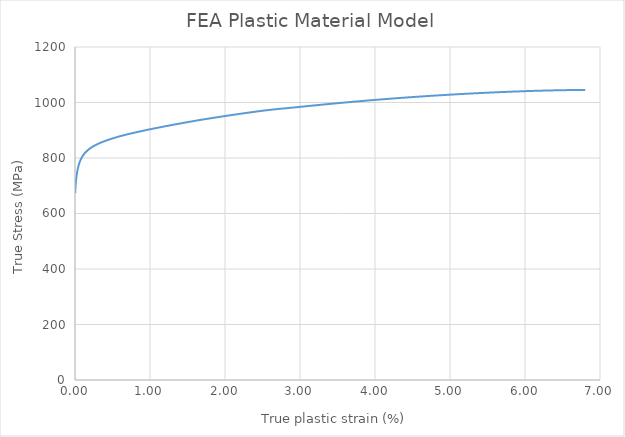
| Category | Series 0 |
|---|---|
| 0.0017616880151286993 | 673.632 |
| 0.008403152648236201 | 702.047 |
| 0.016862855998703147 | 726.623 |
| 0.027291864105012192 | 747.034 |
| 0.039383235160713376 | 763.929 |
| 0.05292911051866906 | 777.743 |
| 0.06766548516431452 | 789.034 |
| 0.08334510321599106 | 798.324 |
| 0.09974437598286301 | 806.085 |
| 0.11666862788183979 | 812.729 |
| 0.1340172182026393 | 818.468 |
| 0.15170188121643072 | 823.489 |
| 0.16964148285664019 | 827.963 |
| 0.1878094826076597 | 831.947 |
| 0.206159085278784 | 835.539 |
| 0.22462478523562804 | 838.878 |
| 0.24319912700896226 | 841.98 |
| 0.2619194940210921 | 844.764 |
| 0.28072487660874357 | 847.361 |
| 0.29956160390301534 | 849.885 |
| 0.3184661813447992 | 852.258 |
| 0.33742974530748804 | 854.498 |
| 0.3564352822394598 | 856.641 |
| 0.37548871659019445 | 858.675 |
| 0.3945427041601182 | 860.701 |
| 0.41365110117698817 | 862.604 |
| 0.43279292542765324 | 864.429 |
| 0.45194954480690536 | 866.214 |
| 0.47113630441185833 | 867.928 |
| 0.49034007254139733 | 869.598 |
| 0.5095607981608199 | 871.225 |
| 0.5288176978213538 | 872.767 |
| 0.5480609265612574 | 874.33 |
| 0.5673085640047968 | 875.877 |
| 0.5865693366143762 | 877.389 |
| 0.6058119453366085 | 878.932 |
| 0.6251492661223561 | 880.264 |
| 0.6445033137288448 | 881.553 |
| 0.663787181921031 | 882.985 |
| 0.6831141888397586 | 884.316 |
| 0.7024772632728765 | 885.563 |
| 0.7218518878790943 | 886.777 |
| 0.74121176712949 | 888.016 |
| 0.7605796193391979 | 889.229 |
| 0.7799441440712891 | 890.442 |
| 0.7993026796232002 | 891.66 |
| 0.8186622167340719 | 892.869 |
| 0.8380372115632981 | 894.036 |
| 0.8574227630842741 | 895.173 |
| 0.8767981002015321 | 896.324 |
| 0.8961674497990773 | 897.481 |
| 0.9155429349305845 | 898.616 |
| 0.9349280082200732 | 899.724 |
| 0.9543017568538025 | 900.847 |
| 0.9736828581999124 | 901.948 |
| 0.9930615175098723 | 903.045 |
| 1.012444513083614 | 904.126 |
| 1.0318126429148455 | 905.231 |
| 1.0512273703280584 | 906.227 |
| 1.070604179148255 | 907.298 |
| 1.0900016322542103 | 908.316 |
| 1.1093773767662758 | 909.373 |
| 1.1287343888276786 | 910.464 |
| 1.1481416184761977 | 911.437 |
| 1.167536587363769 | 912.429 |
| 1.1869026390105442 | 913.477 |
| 1.2062798961085264 | 914.492 |
| 1.2256662324555976 | 915.479 |
| 1.2450421819659354 | 916.482 |
| 1.2644197278524834 | 917.472 |
| 1.283801971352826 | 918.445 |
| 1.3031892726645378 | 919.399 |
| 1.3225604048979605 | 920.381 |
| 1.3419180950797238 | 921.384 |
| 1.3613000569400646 | 922.326 |
| 1.3806752362087862 | 923.275 |
| 1.4000469473275434 | 924.223 |
| 1.4193986343832268 | 925.208 |
| 1.4387605422762306 | 926.162 |
| 1.4581078397188545 | 927.14 |
| 1.4774812638846004 | 928.054 |
| 1.49681401229036 | 929.048 |
| 1.5161256947597983 | 930.08 |
| 1.5355235273010361 | 930.917 |
| 1.5549453438363876 | 931.693 |
| 1.5743040261576575 | 932.599 |
| 1.5936327689486571 | 933.562 |
| 1.6129489022015098 | 934.546 |
| 1.6322686685440588 | 935.513 |
| 1.6516176821922417 | 936.409 |
| 1.6709610053161135 | 937.309 |
| 1.6903308788716112 | 938.143 |
| 1.7097056184357307 | 938.959 |
| 1.7290938190480343 | 939.737 |
| 1.7484359853842641 | 940.608 |
| 1.767792732305169 | 941.439 |
| 1.7871778796046538 | 942.199 |
| 1.8065253129814378 | 943.035 |
| 1.8258345520654238 | 943.946 |
| 1.8452245632540407 | 944.672 |
| 1.8645844579670008 | 945.456 |
| 1.8839016154680852 | 946.326 |
| 1.9032282399676363 | 947.168 |
| 1.9225747246297324 | 947.957 |
| 1.9419168242799247 | 948.749 |
| 1.9612374125100953 | 949.579 |
| 1.9805317899627917 | 950.46 |
| 1.9999063269558408 | 951.156 |
| 2.019254516676692 | 951.901 |
| 2.0385688250035154 | 952.714 |
| 2.0578741861739296 | 953.538 |
| 2.077204402778474 | 954.3 |
| 2.096526022527651 | 955.072 |
| 2.1158386621815803 | 955.856 |
| 2.13515968259653 | 956.614 |
| 2.1544849169993885 | 957.354 |
| 2.1737998507044813 | 958.11 |
| 2.193112878408387 | 958.861 |
| 2.2124146243828013 | 959.629 |
| 2.2317208448768935 | 960.379 |
| 2.2510149531231574 | 961.148 |
| 2.2703347457259113 | 961.853 |
| 2.289636937181222 | 962.588 |
| 2.308945665295502 | 963.3 |
| 2.3282474580624646 | 964.02 |
| 2.347539229302683 | 964.754 |
| 2.3668325468165436 | 965.477 |
| 2.386119368967506 | 966.206 |
| 2.4054186853332613 | 966.899 |
| 2.4247228772984597 | 967.573 |
| 2.443998031990761 | 968.303 |
| 2.4632982806266632 | 968.97 |
| 2.482586130401623 | 969.656 |
| 2.5018591280532867 | 970.368 |
| 2.5211480274244353 | 971.035 |
| 2.540465845020651 | 971.63 |
| 2.5597817799139877 | 972.222 |
| 2.5790958554715107 | 972.809 |
| 2.5984080729983656 | 973.392 |
| 2.617718212120904 | 973.972 |
| 2.637026176486001 | 974.548 |
| 2.656332447009647 | 975.12 |
| 2.675636720165038 | 975.688 |
| 2.6949387821549244 | 976.253 |
| 2.7142416194265375 | 976.808 |
| 2.7335761034678754 | 977.284 |
| 2.752914472991351 | 977.743 |
| 2.7722483671025184 | 978.204 |
| 2.7915675151008923 | 978.689 |
| 2.810870008255817 | 979.204 |
| 2.8301677381297314 | 979.721 |
| 2.8494636719185746 | 980.234 |
| 2.8687578290557374 | 980.742 |
| 2.888047396769901 | 981.253 |
| 2.907331511597753 | 981.768 |
| 2.9266114305200714 | 982.284 |
| 2.9458847028520037 | 982.806 |
| 2.9651500813154232 | 983.339 |
| 2.984415319149578 | 983.863 |
| 3.0036799052789576 | 984.38 |
| 3.022939477816899 | 984.901 |
| 3.042196544867967 | 985.419 |
| 3.061447759645913 | 985.942 |
| 3.0806901320051603 | 986.477 |
| 3.0999264409499956 | 987.017 |
| 3.119165511087871 | 987.542 |
| 3.1384097999147604 | 988.048 |
| 3.157652295851479 | 988.55 |
| 3.176895106528838 | 989.042 |
| 3.196126554548673 | 989.552 |
| 3.2153459851027364 | 990.081 |
| 3.234562850436181 | 990.607 |
| 3.253779370048007 | 991.126 |
| 3.2729991531020617 | 991.63 |
| 3.2922168091145654 | 992.13 |
| 3.3114368449095357 | 992.616 |
| 3.3306454262181546 | 993.12 |
| 3.34984310144253 | 993.641 |
| 3.36903927765612 | 994.156 |
| 3.388236997209315 | 994.66 |
| 3.4074371215824977 | 995.151 |
| 3.4266343291668666 | 995.639 |
| 3.4458296850303203 | 996.124 |
| 3.465017992373908 | 996.616 |
| 3.484198711129193 | 997.118 |
| 3.503376905432491 | 997.617 |
| 3.5225577232977043 | 998.101 |
| 3.541746707064882 | 998.559 |
| 3.560932129553001 | 999.017 |
| 3.580114613547526 | 999.473 |
| 3.599284699836046 | 999.949 |
| 3.6184456456079332 | 1000.437 |
| 3.6376076541155067 | 1000.915 |
| 3.656770425071038 | 1001.383 |
| 3.6759365744768457 | 1001.835 |
| 3.69509633002034 | 1002.293 |
| 3.714254225215857 | 1002.747 |
| 3.7334083690530546 | 1003.202 |
| 3.752555739593984 | 1003.664 |
| 3.7716995390442034 | 1004.125 |
| 3.790846486812733 | 1004.571 |
| 3.8099939669505374 | 1005.008 |
| 3.8291358795737995 | 1005.449 |
| 3.8482753872053697 | 1005.887 |
| 3.867408648094264 | 1006.331 |
| 3.886533994145939 | 1006.786 |
| 3.905658352168031 | 1007.234 |
| 3.9247859301477908 | 1007.666 |
| 3.943920034249236 | 1008.075 |
| 3.9630518928461873 | 1008.481 |
| 3.9821792349070586 | 1008.889 |
| 4.001295759705722 | 1009.314 |
| 4.020402285609338 | 1009.753 |
| 4.039509351072906 | 1010.183 |
| 4.0586147865773805 | 1010.608 |
| 4.077724095951615 | 1011.016 |
| 4.096833347928689 | 1011.416 |
| 4.115941788950897 | 1011.809 |
| 4.135038347438487 | 1012.221 |
| 4.154126576042353 | 1012.644 |
| 4.173214867779718 | 1013.059 |
| 4.192304844011336 | 1013.462 |
| 4.21139546910565 | 1013.854 |
| 4.230483104636811 | 1014.246 |
| 4.249569586321075 | 1014.631 |
| 4.268648048205999 | 1015.027 |
| 4.287722524300546 | 1015.424 |
| 4.306793747930248 | 1015.82 |
| 4.325864041576908 | 1016.209 |
| 4.344941370661999 | 1016.575 |
| 4.364017536894622 | 1016.934 |
| 4.383093493136643 | 1017.286 |
| 4.402158140989183 | 1017.655 |
| 4.421209773698958 | 1018.046 |
| 4.440261566766263 | 1018.429 |
| 4.459312883561803 | 1018.804 |
| 4.478369393873186 | 1019.159 |
| 4.497422698333329 | 1019.513 |
| 4.516476486302468 | 1019.857 |
| 4.535523420779981 | 1020.209 |
| 4.554564213450863 | 1020.567 |
| 4.573599681520053 | 1020.929 |
| 4.592633234846081 | 1021.287 |
| 4.611671152983074 | 1021.626 |
| 4.630705639045711 | 1021.965 |
| 4.649740230404776 | 1022.296 |
| 4.668769716435783 | 1022.63 |
| 4.687790604997014 | 1022.976 |
| 4.706800231682059 | 1023.339 |
| 4.725815285483115 | 1023.682 |
| 4.744835282642407 | 1024.004 |
| 4.7638569788731795 | 1024.314 |
| 4.782878986725088 | 1024.616 |
| 4.801892676290375 | 1024.928 |
| 4.820897710492915 | 1025.252 |
| 4.83989192624763 | 1025.593 |
| 4.8588858564289215 | 1025.926 |
| 4.877881105600689 | 1026.247 |
| 4.896879801241061 | 1026.553 |
| 4.915883071288172 | 1026.839 |
| 4.934878850263214 | 1027.134 |
| 4.953864153351674 | 1027.445 |
| 4.972837561469971 | 1027.776 |
| 4.9918116337722145 | 1028.097 |
| 5.01078697016645 | 1028.407 |
| 5.029766215678242 | 1028.699 |
| 5.0487473375611644 | 1028.978 |
| 5.067725618460582 | 1029.255 |
| 5.086690705256967 | 1029.555 |
| 5.105650411510569 | 1029.859 |
| 5.124606434338731 | 1030.164 |
| 5.143561809633303 | 1030.461 |
| 5.162526901858329 | 1030.728 |
| 5.181493499545476 | 1030.982 |
| 5.200458617969592 | 1031.232 |
| 5.219410381353423 | 1031.504 |
| 5.238354286386505 | 1031.786 |
| 5.257290741738822 | 1032.078 |
| 5.2762261975185725 | 1032.364 |
| 5.295166630386058 | 1032.629 |
| 5.3141117268445575 | 1032.875 |
| 5.333053771780245 | 1033.12 |
| 5.351989828807113 | 1033.37 |
| 5.370920014715032 | 1033.626 |
| 5.389841239232599 | 1033.894 |
| 5.408760147882037 | 1034.16 |
| 5.427679444813724 | 1034.416 |
| 5.446603202867008 | 1034.654 |
| 5.465525373207353 | 1034.886 |
| 5.484443137789347 | 1035.121 |
| 5.503356539277264 | 1035.357 |
| 5.522259703260668 | 1035.609 |
| 5.541155292516832 | 1035.871 |
| 5.56005380256028 | 1036.117 |
| 5.578959736267238 | 1036.338 |
| 5.597870155139634 | 1036.539 |
| 5.616776834393372 | 1036.74 |
| 5.635676130818805 | 1036.951 |
| 5.654566789025452 | 1037.174 |
| 5.673446660711017 | 1037.414 |
| 5.6923243857163675 | 1037.65 |
| 5.7112036606437995 | 1037.874 |
| 5.730084228267165 | 1038.087 |
| 5.7489703972060076 | 1038.278 |
| 5.767859025730522 | 1038.455 |
| 5.786731362619919 | 1038.662 |
| 5.8055949422243645 | 1038.881 |
| 5.824450964052667 | 1039.11 |
| 5.843309474503681 | 1039.325 |
| 5.862172492748088 | 1039.52 |
| 5.881037500301076 | 1039.702 |
| 5.899903399832925 | 1039.873 |
| 5.918763690449704 | 1040.05 |
| 5.937614915557867 | 1040.239 |
| 5.956457240537493 | 1040.441 |
| 5.975294885273499 | 1040.646 |
| 5.9941376920148155 | 1040.831 |
| 6.012987141377129 | 1040.99 |
| 6.031838386334801 | 1041.137 |
| 6.050690157140403 | 1041.274 |
| 6.0695318889692595 | 1041.427 |
| 6.088363302332745 | 1041.596 |
| 6.107186104801316 | 1041.777 |
| 6.126004761659083 | 1041.959 |
| 6.144827627865831 | 1042.123 |
| 6.1636579817898784 | 1042.261 |
| 6.182487599249932 | 1042.391 |
| 6.201313528765398 | 1042.522 |
| 6.220133984424676 | 1042.658 |
| 6.23894711820112 | 1042.803 |
| 6.257753332563451 | 1042.955 |
| 6.276558993535354 | 1043.101 |
| 6.295368108652349 | 1043.23 |
| 6.314180206215286 | 1043.343 |
| 6.332994384444208 | 1043.442 |
| 6.351802701492098 | 1043.547 |
| 6.3706072329172345 | 1043.653 |
| 6.3893980224311555 | 1043.783 |
| 6.40818402482726 | 1043.916 |
| 6.426969671498611 | 1044.041 |
| 6.445765242190834 | 1044.134 |
| 6.464566176673769 | 1044.206 |
| 6.48336766064614 | 1044.268 |
| 6.502163430345043 | 1044.334 |
| 6.520950529107342 | 1044.414 |
| 6.539725467284392 | 1044.514 |
| 6.558497984623098 | 1044.611 |
| 6.577268750020935 | 1044.704 |
| 6.5960456529762315 | 1044.774 |
| 6.614828158044225 | 1044.821 |
| 6.6336132204965 | 1044.854 |
| 6.652388915065554 | 1044.9 |
| 6.671157147113334 | 1044.957 |
| 6.6899160994510165 | 1045.027 |
| 6.70866960546633 | 1045.102 |
| 6.727423443352455 | 1045.167 |
| 6.746187715186506 | 1045.199 |
| 6.764956909062028 | 1045.21 |
| 6.783727420489876 | 1045.209 |
| 6.802487893264095 | 1045.224 |